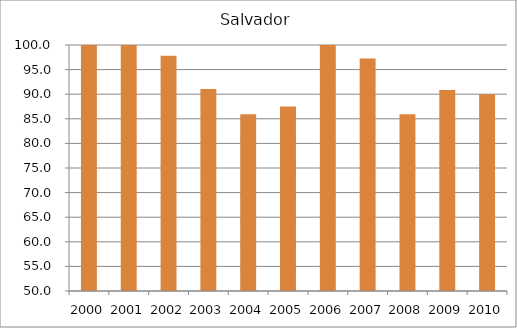
| Category | Salvador |
|---|---|
| 2000.0 | 114.37 |
| 2001.0 | 115.22 |
| 2002.0 | 97.82 |
| 2003.0 | 91.05 |
| 2004.0 | 85.91 |
| 2005.0 | 87.5 |
| 2006.0 | 107.34 |
| 2007.0 | 97.28 |
| 2008.0 | 85.91 |
| 2009.0 | 90.83 |
| 2010.0 | 90.01 |